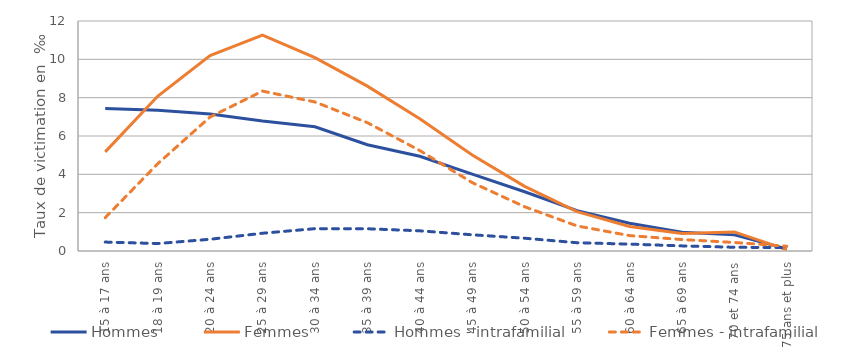
| Category | Hommes | Femmes | Hommes - intrafamilial | Femmes - intrafamilial |
|---|---|---|---|---|
| 15 à 17 ans | 7.436 | 5.173 | 0.466 | 1.738 |
| 18 à 19 ans | 7.348 | 8.073 | 0.39 | 4.55 |
| 20 à 24 ans | 7.15 | 10.198 | 0.612 | 6.992 |
| 25 à 29 ans | 6.777 | 11.266 | 0.927 | 8.342 |
| 30 à 34 ans | 6.479 | 10.085 | 1.165 | 7.776 |
| 35 à 39 ans | 5.542 | 8.6 | 1.16 | 6.696 |
| 40 à 44 ans | 4.941 | 6.904 | 1.053 | 5.241 |
| 45 à 49 ans | 4.013 | 5.007 | 0.846 | 3.568 |
| 50 à 54 ans | 3.091 | 3.374 | 0.667 | 2.309 |
| 55 à 59 ans | 2.104 | 2.053 | 0.431 | 1.308 |
| 60 à 64 ans | 1.446 | 1.276 | 0.359 | 0.804 |
| 65 à 69 ans | 0.981 | 0.918 | 0.267 | 0.598 |
| 70 et 74 ans | 0.842 | 0.997 | 0.195 | 0.444 |
| 75 ans et plus | 0.113 | 0.074 | 0.176 | 0.249 |